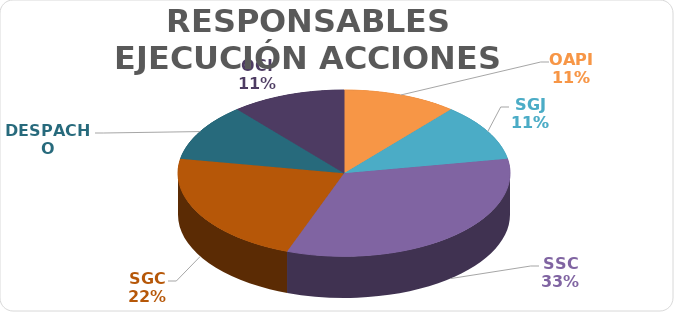
| Category | Series 0 |
|---|---|
| OAPI | 1 |
| SGJ | 1 |
| SSC | 3 |
| SGC | 2 |
| DESPACHO | 1 |
| OCI | 1 |